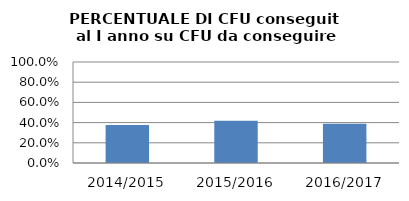
| Category | 2014/2015 2015/2016 2016/2017 |
|---|---|
| 2014/2015 | 0.377 |
| 2015/2016 | 0.419 |
| 2016/2017 | 0.389 |